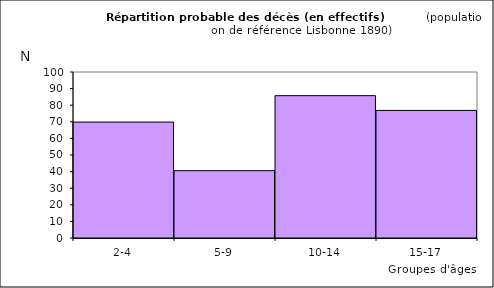
| Category | Series 0 |
|---|---|
| 2-4 | 69.84 |
| 5-9 | 40.56 |
| 10-14 | 85.75 |
| 15-17 | 76.85 |